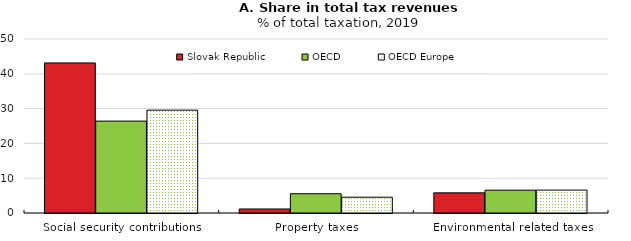
| Category | Slovak Republic | OECD | OECD Europe |
|---|---|---|---|
| Social security contributions | 43.13 | 26.402 | 29.549 |
| Property taxes | 1.15 | 5.539 | 4.536 |
| Environmental related taxes | 5.784 | 6.563 | 6.579 |